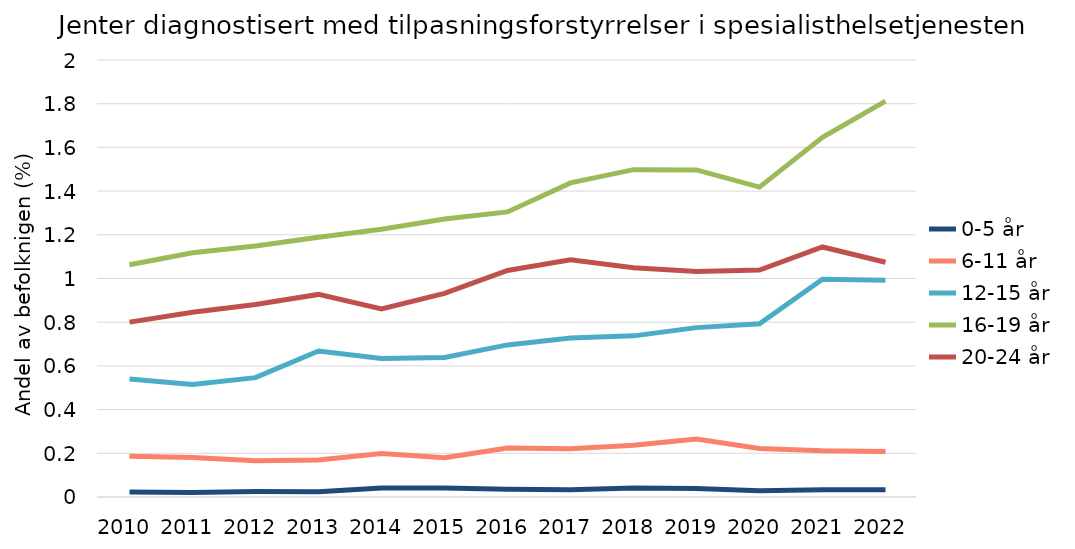
| Category | 0-5 år | 6-11 år | 12-15 år | 16-19 år | 20-24 år |
|---|---|---|---|---|---|
| 2010.0 | 0.023 | 0.186 | 0.54 | 1.063 | 0.8 |
| 2011.0 | 0.021 | 0.181 | 0.515 | 1.118 | 0.845 |
| 2012.0 | 0.025 | 0.166 | 0.546 | 1.149 | 0.881 |
| 2013.0 | 0.024 | 0.169 | 0.668 | 1.189 | 0.927 |
| 2014.0 | 0.041 | 0.199 | 0.634 | 1.225 | 0.861 |
| 2015.0 | 0.041 | 0.18 | 0.639 | 1.272 | 0.932 |
| 2016.0 | 0.036 | 0.224 | 0.696 | 1.305 | 1.037 |
| 2017.0 | 0.033 | 0.221 | 0.728 | 1.438 | 1.085 |
| 2018.0 | 0.041 | 0.237 | 0.737 | 1.498 | 1.049 |
| 2019.0 | 0.039 | 0.265 | 0.775 | 1.497 | 1.032 |
| 2020.0 | 0.028 | 0.222 | 0.792 | 1.418 | 1.039 |
| 2021.0 | 0.033 | 0.211 | 0.997 | 1.646 | 1.144 |
| 2022.0 | 0.033 | 0.208 | 0.992 | 1.812 | 1.074 |